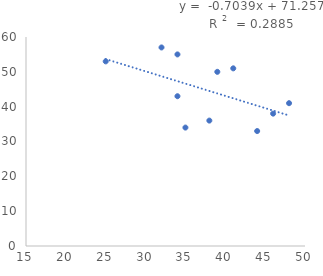
| Category | Series 0 |
|---|---|
| 34.0 | 43 |
| 34.0 | 55 |
| 35.0 | 34 |
| 25.0 | 53 |
| 44.0 | 33 |
| 38.0 | 36 |
| 41.0 | 51 |
| 46.0 | 38 |
| 48.0 | 41 |
| 39.0 | 50 |
| 32.0 | 57 |